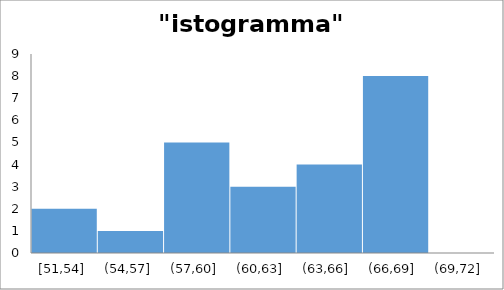
| Category | lettera n |
|---|---|
| 51.0 | 0 |
| 53.0 | 0.087 |
| 56.0 | 0.087 |
| 59.0 | 0.304 |
| 62.0 | 0.435 |
| 65.0 | 0.565 |
| 69.0 | 1 |